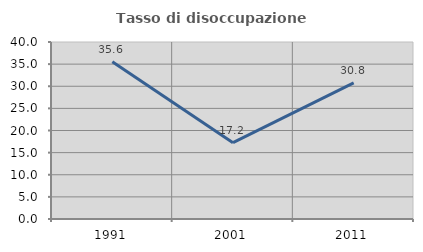
| Category | Tasso di disoccupazione giovanile  |
|---|---|
| 1991.0 | 35.556 |
| 2001.0 | 17.241 |
| 2011.0 | 30.769 |